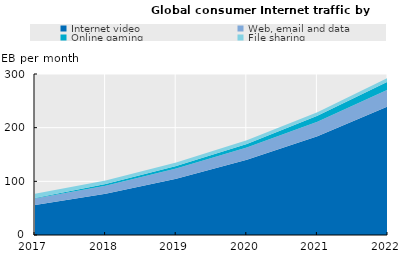
| Category | Internet video | Web, email and data | Online gaming | File sharing |
|---|---|---|---|---|
| 2017.0 | 56 | 12 | 1 | 8 |
| 2018.0 | 77 | 15 | 2.857 | 6.717 |
| 2019.0 | 105 | 19 | 4.396 | 6.554 |
| 2020.0 | 140 | 23 | 6.753 | 7 |
| 2021.0 | 184 | 27 | 11 | 6.595 |
| 2022.0 | 240 | 31 | 15 | 7 |